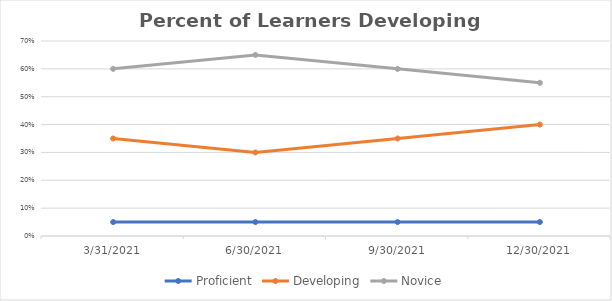
| Category | Proficient | Developing | Novice |
|---|---|---|---|
| 3/31/21 | 0.05 | 0.35 | 0.6 |
| 6/30/21 | 0.05 | 0.3 | 0.65 |
| 9/30/21 | 0.05 | 0.35 | 0.6 |
| 12/30/21 | 0.05 | 0.4 | 0.55 |